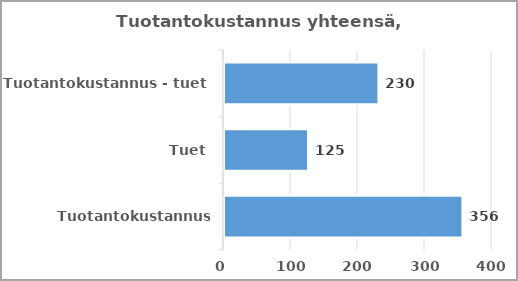
| Category | Series 0 |
|---|---|
| Tuotantokustannus yhteensä | 355.814 |
| Tuet | 125.383 |
| Tuotantokustannus - tuet | 230.431 |